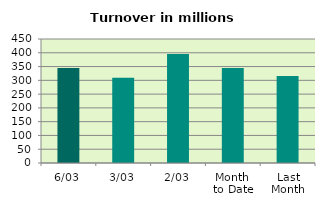
| Category | Series 0 |
|---|---|
| 6/03 | 344.373 |
| 3/03 | 309.289 |
| 2/03 | 395.73 |
| Month 
to Date | 344.949 |
| Last
Month | 316.082 |